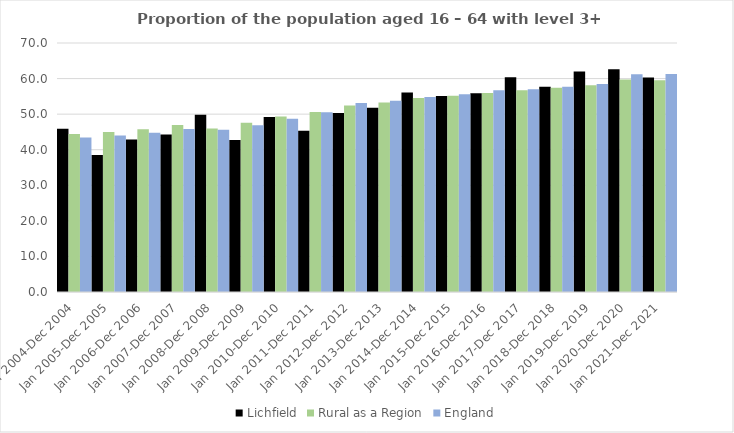
| Category | Lichfield | Rural as a Region | England |
|---|---|---|---|
| Jan 2004-Dec 2004 | 45.9 | 44.405 | 43.4 |
| Jan 2005-Dec 2005 | 38.5 | 44.973 | 44 |
| Jan 2006-Dec 2006 | 42.9 | 45.774 | 44.8 |
| Jan 2007-Dec 2007 | 44.3 | 46.968 | 45.8 |
| Jan 2008-Dec 2008 | 49.8 | 45.964 | 45.6 |
| Jan 2009-Dec 2009 | 42.7 | 47.59 | 46.9 |
| Jan 2010-Dec 2010 | 49.2 | 49.362 | 48.7 |
| Jan 2011-Dec 2011 | 45.3 | 50.602 | 50.5 |
| Jan 2012-Dec 2012 | 50.3 | 52.439 | 53.1 |
| Jan 2013-Dec 2013 | 51.8 | 53.276 | 53.8 |
| Jan 2014-Dec 2014 | 56.1 | 54.57 | 54.8 |
| Jan 2015-Dec 2015 | 55.1 | 55.16 | 55.6 |
| Jan 2016-Dec 2016 | 55.9 | 55.941 | 56.7 |
| Jan 2017-Dec 2017 | 60.4 | 56.689 | 57 |
| Jan 2018-Dec 2018 | 57.7 | 57.389 | 57.7 |
| Jan 2019-Dec 2019 | 62 | 58.147 | 58.5 |
| Jan 2020-Dec 2020 | 62.6 | 59.771 | 61.2 |
| Jan 2021-Dec 2021 | 60.3 | 59.54 | 61.3 |